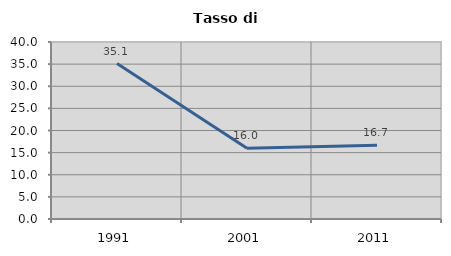
| Category | Tasso di disoccupazione   |
|---|---|
| 1991.0 | 35.131 |
| 2001.0 | 16.011 |
| 2011.0 | 16.667 |